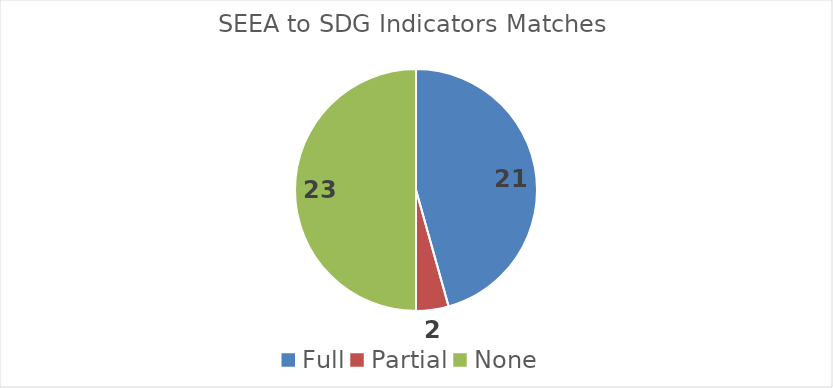
| Category | Series 0 |
|---|---|
| Full | 21 |
| Partial | 2 |
| None | 23 |